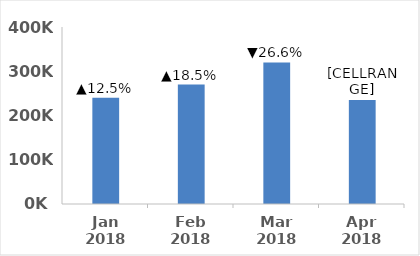
| Category | Sales |
|---|---|
| 2018-01-01 | 240000 |
| 2018-02-01 | 270000 |
| 2018-03-01 | 320000 |
| 2018-04-01 | 235000 |